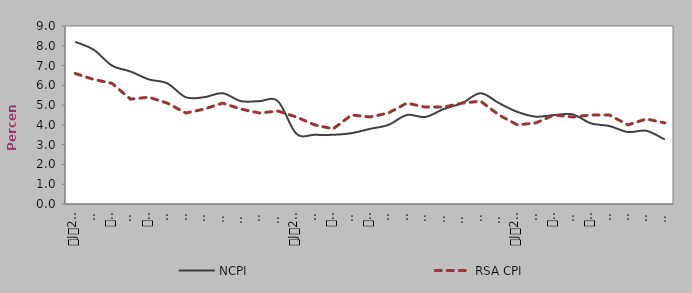
| Category | NCPI | RSA CPI |
|---|---|---|
| 0 | 8.2 | 6.6 |
| 1900-01-01 | 7.8 | 6.3 |
| 1900-01-02 | 7 | 6.1 |
| 1900-01-03 | 6.7 | 5.3 |
| 1900-01-04 | 6.3 | 5.4 |
| 1900-01-05 | 6.1 | 5.1 |
| 1900-01-06 | 5.4 | 4.6 |
| 1900-01-07 | 5.4 | 4.8 |
| 1900-01-08 | 5.6 | 5.1 |
| 1900-01-09 | 5.2 | 4.8 |
| 1900-01-10 | 5.2 | 4.6 |
| 1900-01-11 | 5.2 | 4.7 |
| 1900-01-12 | 3.555 | 4.4 |
| 1900-01-13 | 3.5 | 4 |
| 1900-01-14 | 3.5 | 3.8 |
| 1900-01-15 | 3.581 | 4.5 |
| 1900-01-16 | 3.8 | 4.4 |
| 1900-01-17 | 4 | 4.6 |
| 1900-01-18 | 4.5 | 5.1 |
| 1900-01-19 | 4.4 | 4.9 |
| 1900-01-20 | 4.8 | 4.9 |
| 1900-01-21 | 5.1 | 5.1 |
| 1900-01-22 | 5.6 | 5.2 |
| 1900-01-23 | 5.1 | 4.5 |
| 1900-01-24 | 4.658 | 4 |
| 1900-01-25 | 4.416 | 4.1 |
| 1900-01-26 | 4.498 | 4.5 |
| 1900-01-27 | 4.529 | 4.4 |
| 1900-01-28 | 4.076 | 4.5 |
| 1900-01-29 | 3.939 | 4.5 |
| 1900-01-30 | 3.639 | 4 |
| 1900-01-31 | 3.7 | 4.3 |
| 1900-02-01 | 3.259 | 4.1 |